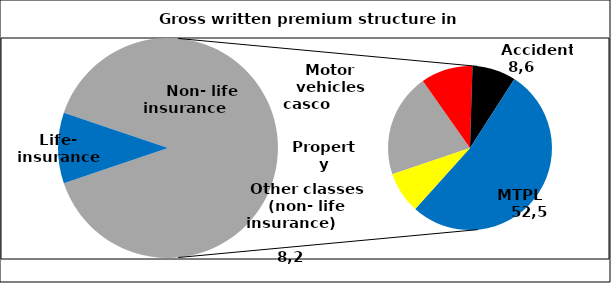
| Category | Series 0 |
|---|---|
| Осигурување на живот | 11.6 |
| Имот | 20.451 |
| Моторни возила, каско | 10.233 |
| Незгода | 8.616 |
| Моторни возила, одговорност | 52.543 |
| Останато-неживотно осигурување | 8.157 |